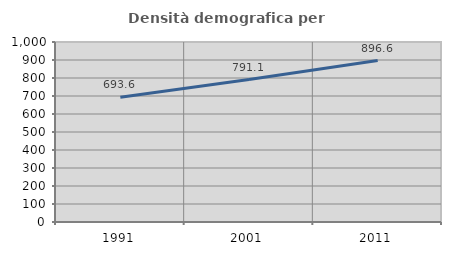
| Category | Densità demografica |
|---|---|
| 1991.0 | 693.598 |
| 2001.0 | 791.124 |
| 2011.0 | 896.619 |